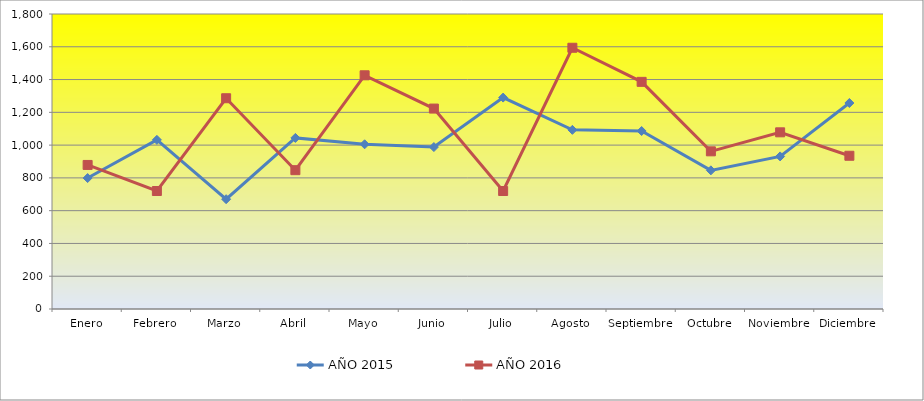
| Category | AÑO 2015 | AÑO 2016 |
|---|---|---|
| Enero | 799 | 879 |
| Febrero | 1032 | 720 |
| Marzo | 670 | 1286 |
| Abril | 1044 | 847 |
| Mayo | 1005 | 1426 |
| Junio | 988 | 1223 |
| Julio | 1290 | 720 |
| Agosto | 1093 | 1594 |
| Septiembre | 1086 | 1386 |
| Octubre | 846 | 962 |
| Noviembre | 931 | 1078 |
| Diciembre | 1257 | 935 |